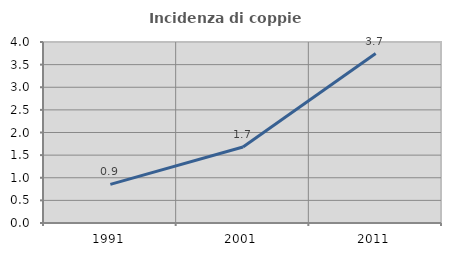
| Category | Incidenza di coppie miste |
|---|---|
| 1991.0 | 0.854 |
| 2001.0 | 1.68 |
| 2011.0 | 3.745 |